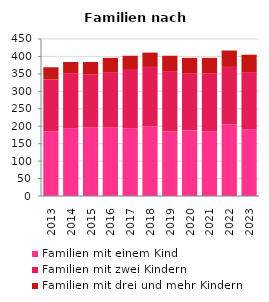
| Category | Familien mit einem Kind | Familien mit zwei Kindern | Familien mit drei und mehr Kindern |
|---|---|---|---|
| 2013.0 | 185 | 149 | 35 |
| 2014.0 | 194 | 158 | 32 |
| 2015.0 | 197 | 152 | 35 |
| 2016.0 | 197 | 158 | 41 |
| 2017.0 | 194 | 170 | 38 |
| 2018.0 | 200 | 170 | 41 |
| 2019.0 | 185 | 173 | 44 |
| 2020.0 | 188 | 164 | 44 |
| 2021.0 | 185 | 167 | 44 |
| 2022.0 | 206 | 164 | 47 |
| 2023.0 | 191 | 164 | 50 |